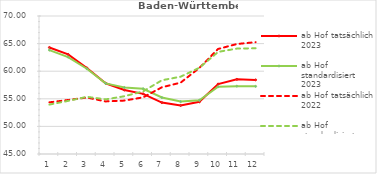
| Category | ab Hof tatsächlich 2023 | ab Hof standardisiert 2023 | ab Hof tatsächlich 2022 | ab Hof standardisiert 2022 |
|---|---|---|---|---|
| 0 | 64.297 | 63.829 | 54.361 | 53.955 |
| 1 | 63.037 | 62.558 | 54.783 | 54.624 |
| 2 | 60.592 | 60.442 | 55.23 | 55.358 |
| 3 | 57.814 | 57.795 | 54.526 | 54.899 |
| 4 | 56.591 | 57.05 | 54.676 | 55.464 |
| 5 | 55.898 | 56.819 | 55.261 | 56.343 |
| 6 | 54.312 | 55.231 | 57.085 | 58.359 |
| 7 | 53.8 | 54.494 | 57.925 | 59.007 |
| 8 | 54.448 | 54.745 | 60.595 | 60.619 |
| 9 | 57.669 | 57.183 | 64.03 | 63.496 |
| 10 | 58.522 | 57.288 | 64.925 | 64.096 |
| 11 | 58.428 | 57.256 | 65.263 | 64.154 |